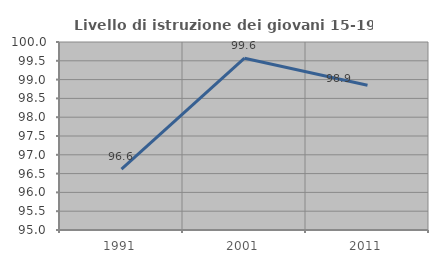
| Category | Livello di istruzione dei giovani 15-19 anni |
|---|---|
| 1991.0 | 96.617 |
| 2001.0 | 99.569 |
| 2011.0 | 98.851 |